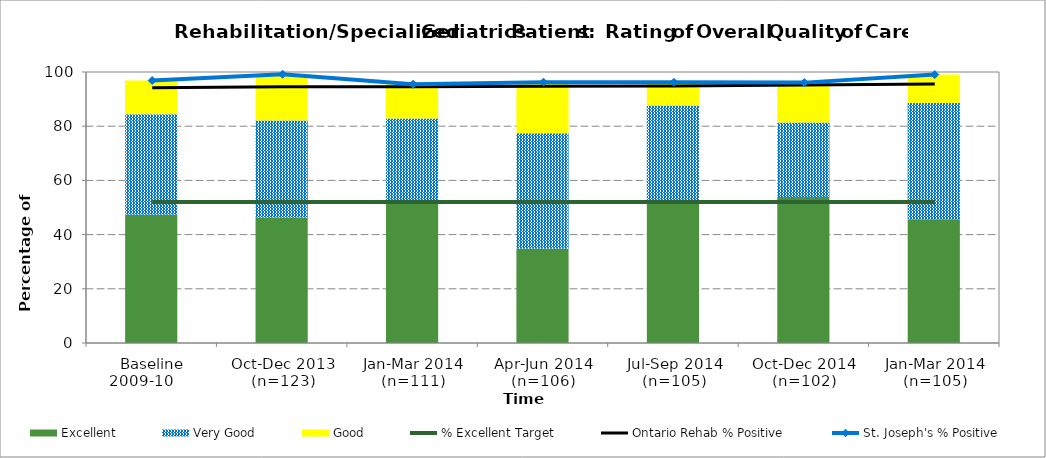
| Category | Excellent | Very Good | Good |
|---|---|---|---|
| Baseline 2009-10      | 47.32 | 37.12 | 12.42 |
| Oct-Dec 2013 (n=123) | 46.34 | 35.77 | 17.07 |
| Jan-Mar 2014 (n=111) | 51.35 | 31.53 | 12.61 |
| Apr-Jun 2014 (n=106) | 34.91 | 42.45 | 18.87 |
| Jul-Sep 2014 (n=105) | 51.43 | 36.19 | 8.57 |
| Oct-Dec 2014 (n=102) | 53.92 | 27.45 | 14.71 |
| Jan-Mar 2014 (n=105) | 45.71 | 42.86 | 10.48 |